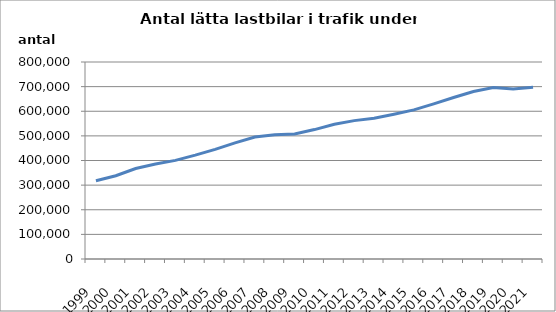
| Category | Series 0 |
|---|---|
| 1999.0 | 317665 |
| 2000.0 | 337939 |
| 2001.0 | 367472 |
| 2002.0 | 385708 |
| 2003.0 | 400511 |
| 2004.0 | 421708 |
| 2005.0 | 445394 |
| 2006.0 | 471809 |
| 2007.0 | 495214 |
| 2008.0 | 504850 |
| 2009.0 | 507566 |
| 2010.0 | 525547 |
| 2011.0 | 547033 |
| 2012.0 | 561948 |
| 2013.0 | 571800 |
| 2014.0 | 587802 |
| 2015.0 | 605470 |
| 2016.0 | 630096 |
| 2017.0 | 655881 |
| 2018.0 | 680384 |
| 2019.0 | 696742 |
| 2020.0 | 690216 |
| 2021.0 | 697301 |